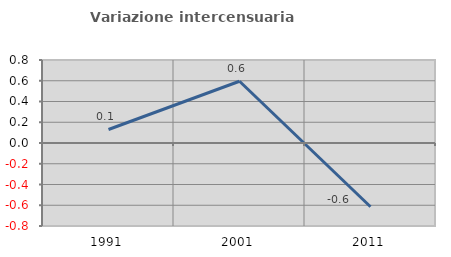
| Category | Variazione intercensuaria annua |
|---|---|
| 1991.0 | 0.13 |
| 2001.0 | 0.595 |
| 2011.0 | -0.615 |